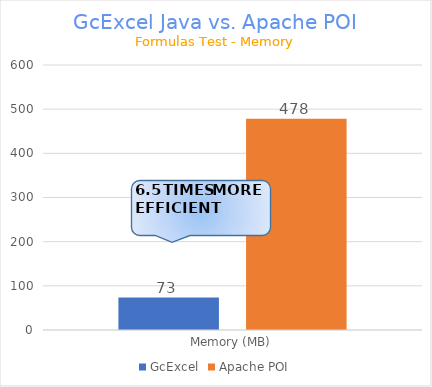
| Category | GcExcel | Apache POI |
|---|---|---|
| Memory (MB) | 73.38 | 478.041 |